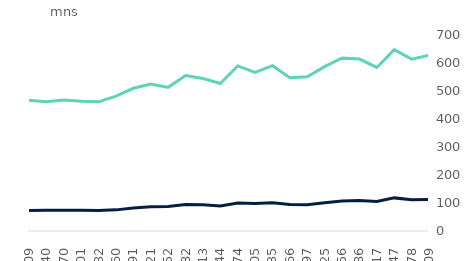
| Category | debit cards | credit cards |
|---|---|---|
| 2017-10-01 | 466.62 | 72.84 |
| 2017-11-01 | 461.867 | 73.727 |
| 2017-12-01 | 468.231 | 74.269 |
| 2018-01-01 | 463.358 | 74.087 |
| 2018-02-01 | 461.348 | 73.084 |
| 2018-03-01 | 481.761 | 75.455 |
| 2018-04-01 | 509.676 | 82.42 |
| 2018-05-01 | 524.76 | 86.861 |
| 2018-06-01 | 513.006 | 87.823 |
| 2018-07-01 | 554.894 | 94.899 |
| 2018-08-01 | 544.47 | 93.373 |
| 2018-09-01 | 526.577 | 89.575 |
| 2018-10-01 | 589.592 | 99.877 |
| 2018-11-01 | 566.364 | 97.868 |
| 2018-12-01 | 590.378 | 100.955 |
| 2019-01-01 | 547.375 | 94.777 |
| 2019-02-01 | 550.556 | 93.822 |
| 2019-03-01 | 586.934 | 100.857 |
| 2019-04-01 | 618.12 | 106.81 |
| 2019-05-01 | 614.102 | 109.004 |
| 2019-06-01 | 584.189 | 105.099 |
| 2019-07-01 | 647.413 | 118.264 |
| 2019-08-01 | 613.73 | 111.773 |
| 2019-09-01 | 627.448 | 112.6 |